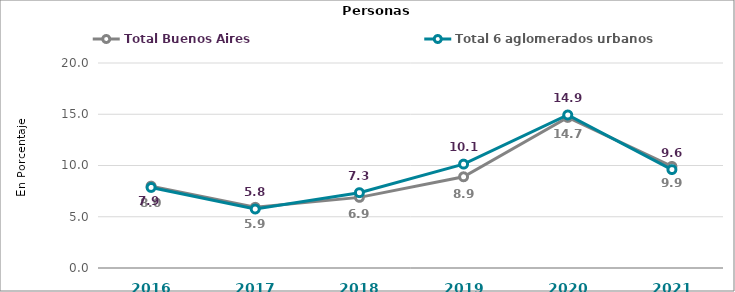
| Category | Resto de Buenos Aires | Total Buenos Aires | Total 6 aglomerados urbanos  |
|---|---|---|---|
| 2016.0 |  | 7.99 | 7.86 |
| 2017.0 |  | 5.92 | 5.753 |
| 2018.0 |  | 6.89 | 7.35 |
| 2019.0 |  | 8.9 | 10.137 |
| 2020.0 |  | 14.69 | 14.93 |
| 2021.0 |  | 9.91 | 9.6 |